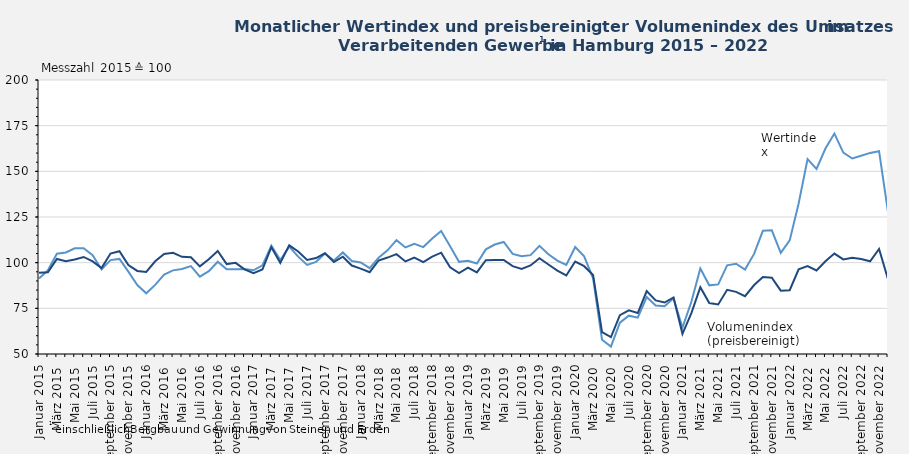
| Category | Wertindex | Volumenindex (preisbereinigt) |
|---|---|---|
| Januar 2015 | 91.366 | 94.476 |
| Februar 2015 | 95.804 | 94.687 |
| März 2015 | 104.885 | 102.002 |
| April 2015 | 105.565 | 100.764 |
| Mai 2015 | 107.859 | 101.724 |
| Juni 2015 | 107.882 | 103.123 |
| Juli 2015 | 104.098 | 100.675 |
| August 2015 | 96.278 | 97.05 |
| September 2015 | 101.4 | 105.009 |
| Oktober 2015 | 102.068 | 106.252 |
| November 2015 | 95.096 | 98.719 |
| Dezember 2015 | 87.789 | 95.481 |
| Januar 2016 | 83.239 | 94.914 |
| Februar 2016 | 87.837 | 100.76 |
| März 2016 | 93.493 | 104.735 |
| April 2016 | 95.774 | 105.38 |
| Mai 2016 | 96.525 | 103.172 |
| Juni 2016 | 98.103 | 102.974 |
| Juli 2016 | 92.36 | 97.978 |
| August 2016 | 95.327 | 101.817 |
| September 2016 | 100.532 | 106.407 |
| Oktober 2016 | 96.347 | 99.232 |
| November 2016 | 96.344 | 99.906 |
| Dezember 2016 | 96.509 | 96.372 |
| Januar 2017 | 95.827 | 94.279 |
| Februar 2017 | 98.54 | 96.235 |
| März 2017 | 109.314 | 108.458 |
| April 2017 | 101.403 | 99.85 |
| Mai 2017 | 108.814 | 109.505 |
| Juni 2017 | 103.292 | 106.108 |
| Juli 2017 | 98.787 | 101.475 |
| August 2017 | 100.452 | 102.521 |
| September 2017 | 105.005 | 105.118 |
| Oktober 2017 | 101.145 | 100.337 |
| November 2017 | 105.61 | 103.283 |
| Dezember 2017 | 100.879 | 98.419 |
| Januar 2018 | 100.103 | 96.747 |
| Februar 2018 | 96.962 | 94.791 |
| März 2018 | 102.673 | 101.189 |
| April 2018 | 106.746 | 102.794 |
| Mai 2018 | 112.314 | 104.68 |
| Juni 2018 | 108.354 | 100.67 |
| Juli 2018 | 110.378 | 102.833 |
| August 2018 | 108.542 | 100.325 |
| September 2018 | 113.201 | 103.314 |
| Oktober 2018 | 117.294 | 105.469 |
| November 2018 | 108.964 | 97.452 |
| Dezember 2018 | 100.445 | 94.284 |
| Januar 2019 | 101.085 | 97.317 |
| Februar 2019 | 99.516 | 94.665 |
| März 2019 | 107.274 | 101.332 |
| April 2019 | 109.919 | 101.517 |
| Mai 2019 | 111.331 | 101.454 |
| Juni 2019 | 104.823 | 98.128 |
| Juli 2019 | 103.571 | 96.535 |
| August 2019 | 104.113 | 98.495 |
| September 2019 | 109.195 | 102.398 |
| Oktober 2019 | 104.615 | 98.974 |
| November 2019 | 101.091 | 95.619 |
| Dezember 2019 | 98.781 | 93.01 |
| Januar 2020 | 108.592 | 100.605 |
| Februar 2020 | 103.443 | 98.082 |
| März 2020 | 91.466 | 93.25 |
| April 2020 | 57.823 | 61.975 |
| Mai 2020 | 54.044 | 59.204 |
| Juni 2020 | 67.142 | 71.285 |
| Juli 2020 | 70.977 | 73.885 |
| August 2020 | 69.894 | 72.434 |
| September 2020 | 81.161 | 84.437 |
| Oktober 2020 | 76.506 | 79.33 |
| November 2020 | 76.208 | 78.192 |
| Dezember 2020 | 80.563 | 80.954 |
| Januar 2021 | 64.501 | 61.069 |
| Februar 2021 | 78.596 | 72.359 |
| März 2021 | 96.834 | 86.559 |
| April 2021 | 87.59 | 77.911 |
| Mai 2021 | 88.107 | 77.116 |
| Juni 2021 | 98.558 | 85.127 |
| Juli 2021 | 99.399 | 83.999 |
| August 2021 | 96.245 | 81.612 |
| September 2021 | 104.644 | 87.605 |
| Oktober 2021 | 117.452 | 92.181 |
| November 2021 | 117.73 | 91.724 |
| Dezember 2021 | 105.33 | 84.686 |
| Januar 2022 | 112.199 | 84.934 |
| Februar 2022 | 132.435 | 96.403 |
| März 2022 | 156.709 | 98.101 |
| April 2022 | 151.337 | 95.733 |
| Mai 2022 | 162.473 | 100.725 |
| Juni 2022 | 170.658 | 104.966 |
| Juli 2022 | 160.259 | 101.774 |
| August 2022 | 157.026 | 102.634 |
| September 2022 | 158.501 | 102 |
| Oktober 2022 | 160.087 | 100.734 |
| November 2022 | 161.015 | 107.532 |
| Dezember 2022 | 127.767 | 90.953 |